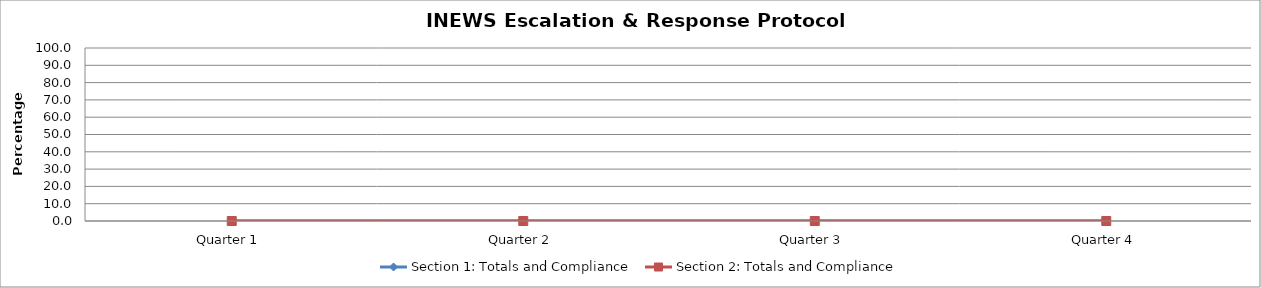
| Category | Section 1: Totals and Compliance | Section 2: Totals and Compliance |
|---|---|---|
| Quarter 1 | 0 | 0 |
| Quarter 2 | 0 | 0 |
| Quarter 3 | 0 | 0 |
| Quarter 4 | 0 | 0 |